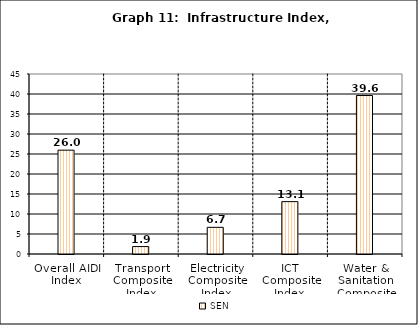
| Category | Series 0 | SEN | Series 2 |
|---|---|---|---|
| Overall AIDI Index |  | 25.959 |  |
| Transport Composite Index |  | 1.859 |  |
| Electricity Composite Index |  | 6.667 |  |
| ICT Composite Index  |  | 13.092 |  |
| Water & Sanitation Composite Index |  | 39.617 |  |